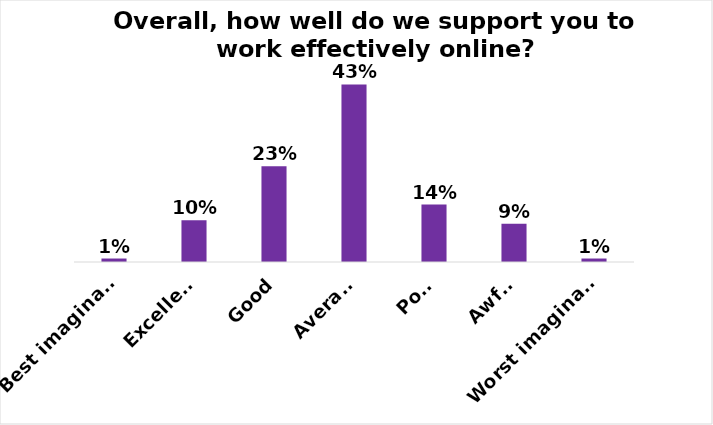
| Category | Overall, how would you rate the quality of support for online and virtual research? |
|---|---|
| Best imaginable | 0.008 |
| Excellent | 0.1 |
| Good | 0.229 |
| Average | 0.425 |
| Poor | 0.138 |
| Awful | 0.092 |
| Worst imaginable | 0.008 |